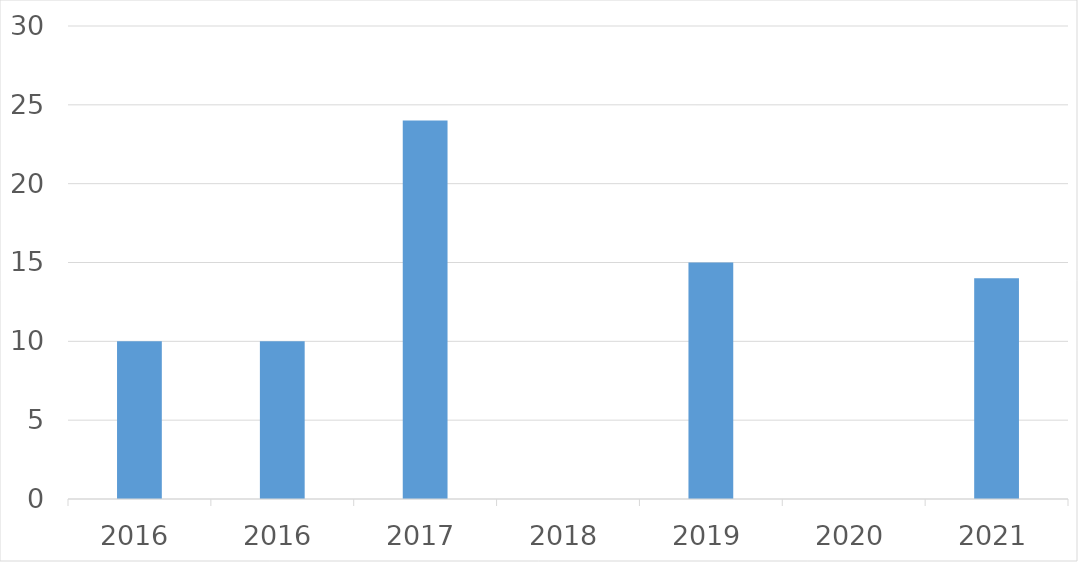
| Category | Series 0 |
|---|---|
| 2016 | 10 |
| 2016 | 10 |
| 2017 | 24 |
| 2018 | 0 |
| 2019 | 15 |
| 2020 | 0 |
| 2021 | 14 |